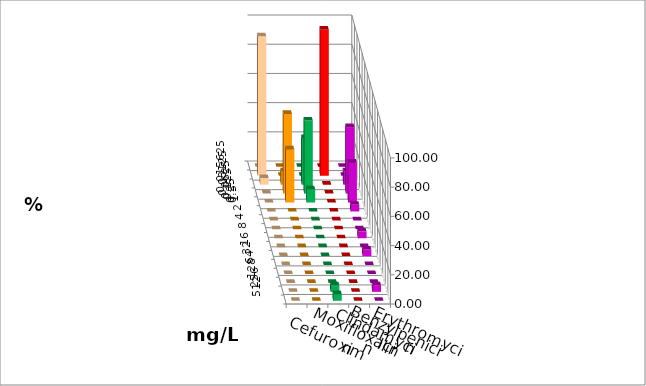
| Category | Cefuroxim | Moxifloxacin | Clindamycin | Benzylpenicillin | Erythromycin |
|---|---|---|---|---|---|
| 0.015625 | 0 | 0 | 0 | 0 | 0 |
| 0.03125 | 95.455 | 0 | 0 | 100 | 0 |
| 0.0625 | 4.545 | 9.091 | 31.818 | 0 | 9.091 |
| 0.125 | 0 | 54.545 | 50 | 0 | 45.455 |
| 0.25 | 0 | 36.364 | 9.091 | 0 | 27.273 |
| 0.5 | 0 | 0 | 0 | 0 | 4.545 |
| 1.0 | 0 | 0 | 0 | 0 | 0 |
| 2.0 | 0 | 0 | 0 | 0 | 0 |
| 4.0 | 0 | 0 | 0 | 0 | 4.545 |
| 8.0 | 0 | 0 | 0 | 0 | 0 |
| 16.0 | 0 | 0 | 0 | 0 | 4.545 |
| 32.0 | 0 | 0 | 0 | 0 | 0 |
| 64.0 | 0 | 0 | 0 | 0 | 0 |
| 128.0 | 0 | 0 | 0 | 0 | 0 |
| 256.0 | 0 | 0 | 4.545 | 0 | 4.545 |
| 512.0 | 0 | 0 | 4.545 | 0 | 0 |